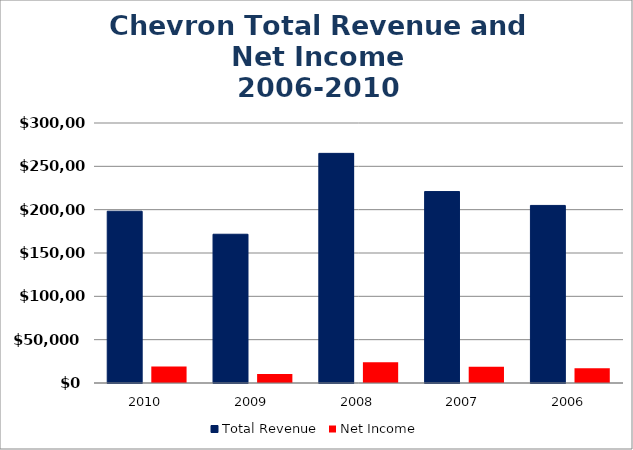
| Category | Total Revenue | Net Income |
|---|---|---|
| 2010.0 | 198198 | 19024 |
| 2009.0 | 171636 | 10483 |
| 2008.0 | 264958 | 23931 |
| 2007.0 | 220904 | 18688 |
| 2006.0 | 204892 | 17138 |